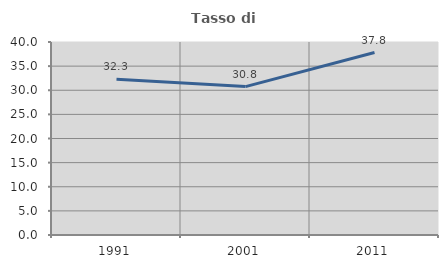
| Category | Tasso di occupazione   |
|---|---|
| 1991.0 | 32.255 |
| 2001.0 | 30.757 |
| 2011.0 | 37.813 |